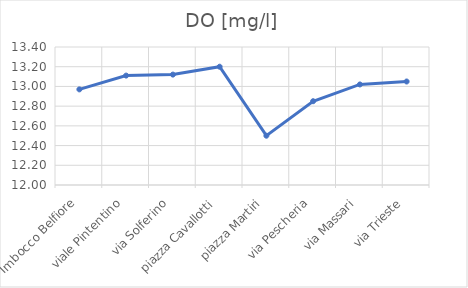
| Category | DO [mg/l] |
|---|---|
| Imbocco Belfiore | 12.97 |
| viale Pintentino | 13.11 |
| via Solferino | 13.12 |
| piazza Cavallotti | 13.2 |
| piazza Martiri | 12.5 |
| via Pescheria | 12.85 |
| via Massari | 13.02 |
| via Trieste | 13.05 |